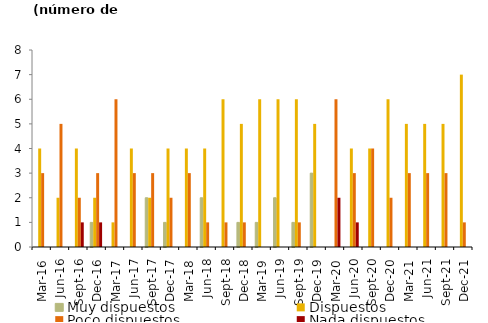
| Category | Muy dispuestos | Dispuestos | Poco dispuestos | Nada dispuestos |
|---|---|---|---|---|
| 2016-03-01 | 0 | 4 | 3 | 0 |
| 2016-06-01 | 0 | 2 | 5 | 0 |
| 2016-09-01 | 0 | 4 | 2 | 1 |
| 2016-12-01 | 1 | 2 | 3 | 1 |
| 2017-03-01 | 0 | 1 | 6 | 0 |
| 2017-06-01 | 0 | 4 | 3 | 0 |
| 2017-09-01 | 2 | 2 | 3 | 0 |
| 2017-12-01 | 1 | 4 | 2 | 0 |
| 2018-03-01 | 0 | 4 | 3 | 0 |
| 2018-06-01 | 2 | 4 | 1 | 0 |
| 2018-09-01 | 0 | 6 | 1 | 0 |
| 2018-12-01 | 1 | 5 | 1 | 0 |
| 2019-03-01 | 1 | 6 | 0 | 0 |
| 2019-06-01 | 2 | 6 | 0 | 0 |
| 2019-09-01 | 1 | 6 | 1 | 0 |
| 2019-12-01 | 3 | 5 | 0 | 0 |
| 2020-03-01 | 0 | 0 | 6 | 2 |
| 2020-06-01 | 0 | 4 | 3 | 1 |
| 2020-09-01 | 0 | 4 | 4 | 0 |
| 2020-12-01 | 0 | 6 | 2 | 0 |
| 2021-03-01 | 0 | 5 | 3 | 0 |
| 2021-06-01 | 0 | 5 | 3 | 0 |
| 2021-09-01 | 0 | 5 | 3 | 0 |
| 2021-12-01 | 0 | 7 | 1 | 0 |